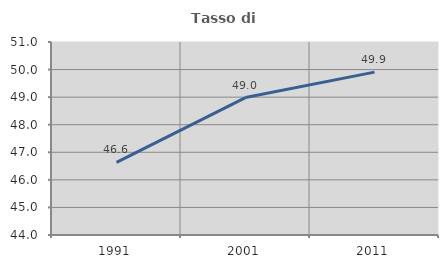
| Category | Tasso di occupazione   |
|---|---|
| 1991.0 | 46.632 |
| 2001.0 | 48.984 |
| 2011.0 | 49.908 |